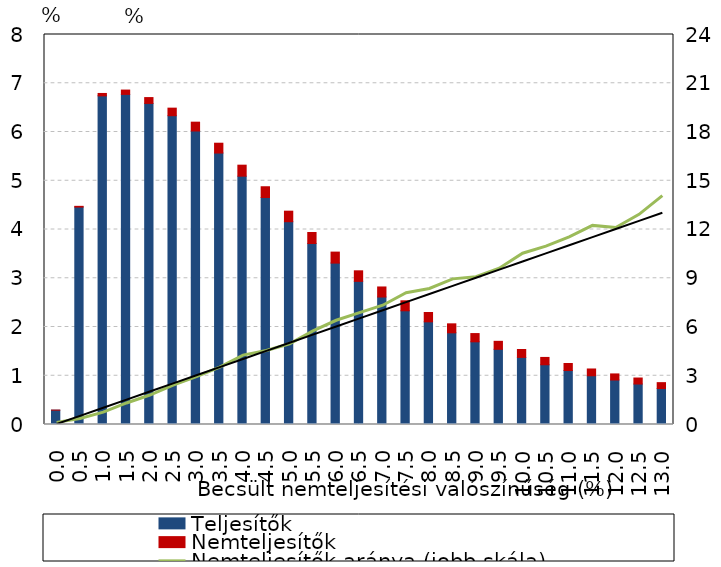
| Category | Teljesítők | Nemteljesítők |
|---|---|---|
| 0.0 | 0.294 | 0 |
| 0.5 | 4.46 | 0.015 |
| 1.0 | 6.741 | 0.05 |
| 1.5 | 6.771 | 0.089 |
| 2.0 | 6.586 | 0.12 |
| 2.5 | 6.334 | 0.155 |
| 3.0 | 6.021 | 0.181 |
| 3.5000000000000004 | 5.568 | 0.202 |
| 4.0 | 5.094 | 0.226 |
| 4.5 | 4.656 | 0.221 |
| 5.0 | 4.16 | 0.216 |
| 5.5 | 3.713 | 0.226 |
| 6.0 | 3.31 | 0.226 |
| 6.5 | 2.936 | 0.216 |
| 7.000000000000001 | 2.615 | 0.206 |
| 7.5 | 2.332 | 0.205 |
| 8.0 | 2.106 | 0.192 |
| 8.5 | 1.88 | 0.184 |
| 9.0 | 1.696 | 0.169 |
| 9.5 | 1.543 | 0.164 |
| 10.0 | 1.376 | 0.162 |
| 10.5 | 1.225 | 0.151 |
| 11.0 | 1.107 | 0.144 |
| 11.5 | 1 | 0.139 |
| 12.0 | 0.912 | 0.125 |
| 12.5 | 0.83 | 0.123 |
| 13.0 | 0.738 | 0.121 |